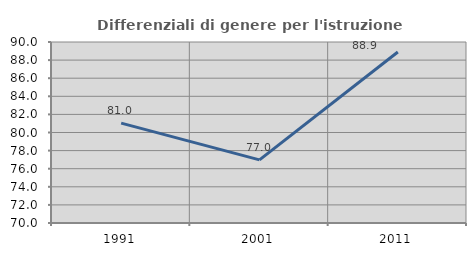
| Category | Differenziali di genere per l'istruzione superiore |
|---|---|
| 1991.0 | 81.031 |
| 2001.0 | 76.976 |
| 2011.0 | 88.889 |